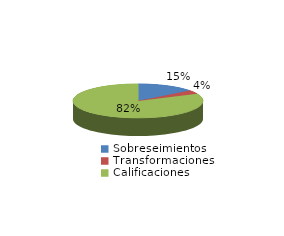
| Category | Series 0 |
|---|---|
| Sobreseimientos | 326 |
| Transformaciones | 79 |
| Calificaciones | 1830 |